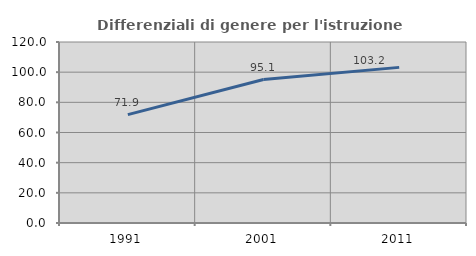
| Category | Differenziali di genere per l'istruzione superiore |
|---|---|
| 1991.0 | 71.875 |
| 2001.0 | 95.122 |
| 2011.0 | 103.175 |